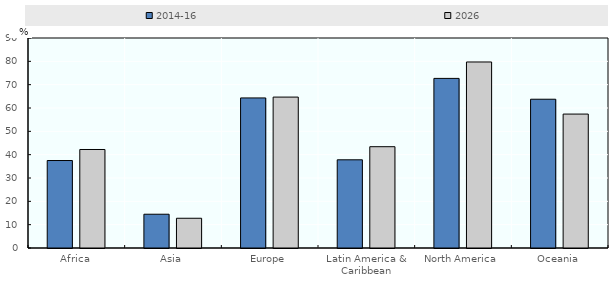
| Category | 2014-16 | 2026 |
|---|---|---|
| Africa | 37.49 | 42.216 |
| Asia | 14.476 | 12.745 |
| Europe | 64.318 | 64.679 |
| Latin America & Caribbean | 37.795 | 43.414 |
| North America | 72.689 | 79.722 |
| Oceania | 63.76 | 57.398 |